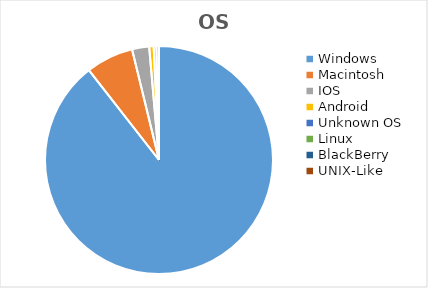
| Category | Series 0 |
|---|---|
| Windows | 1812842 |
| Macintosh | 136673 |
| IOS | 49158 |
| Android | 12840 |
| Unknown OS | 7420 |
| Linux | 7257 |
| BlackBerry | 335 |
| UNIX-Like | 120 |